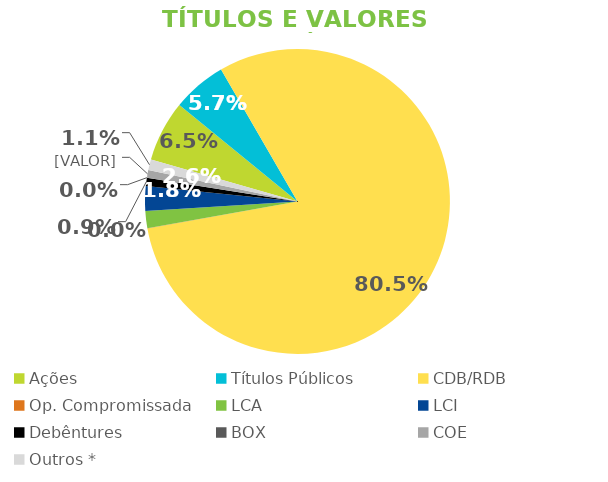
| Category | TVM |
|---|---|
| Ações | 0.065 |
| Títulos Públicos | 0.057 |
| CDB/RDB | 0.805 |
| Op. Compromissada | 0 |
| LCA | 0.018 |
| LCI | 0.026 |
| Debêntures | 0.009 |
| BOX | 0 |
| COE | 0.008 |
| Outros * | 0.011 |